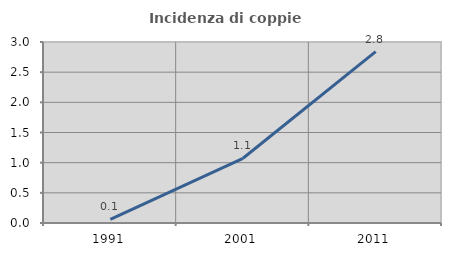
| Category | Incidenza di coppie miste |
|---|---|
| 1991.0 | 0.061 |
| 2001.0 | 1.073 |
| 2011.0 | 2.841 |